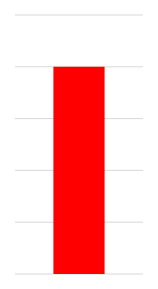
| Category | Series 0 | Series 1 |
|---|---|---|
| 0 | 8000 | 2000 |